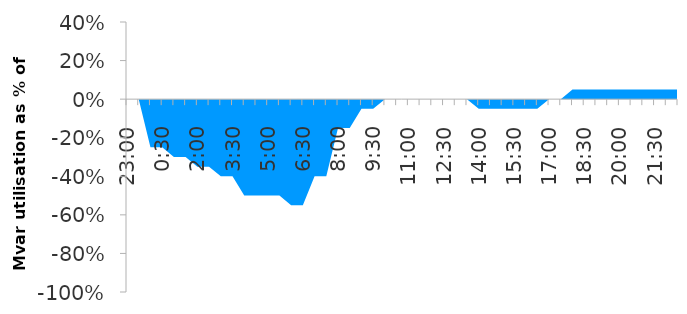
| Category | Series 0 |
|---|---|
| 0.9583333333333334 | 0 |
| 0.9791666666666666 | 0 |
| 0.0 | -0.25 |
| 0.020833333333333332 | -0.25 |
| 0.041666666666666664 | -0.3 |
| 0.0625 | -0.3 |
| 0.08333333333333333 | -0.35 |
| 0.10416666666666667 | -0.35 |
| 0.125 | -0.4 |
| 0.14583333333333334 | -0.4 |
| 0.16666666666666666 | -0.5 |
| 0.1875 | -0.5 |
| 0.20833333333333334 | -0.5 |
| 0.22916666666666666 | -0.5 |
| 0.25 | -0.55 |
| 0.2708333333333333 | -0.55 |
| 0.2916666666666667 | -0.4 |
| 0.3125 | -0.4 |
| 0.3333333333333333 | -0.15 |
| 0.3541666666666667 | -0.15 |
| 0.375 | -0.05 |
| 0.3958333333333333 | -0.05 |
| 0.4166666666666667 | 0 |
| 0.4375 | 0 |
| 0.4583333333333333 | 0 |
| 0.4791666666666667 | 0 |
| 0.5 | 0 |
| 0.5208333333333334 | 0 |
| 0.5416666666666666 | 0 |
| 0.5625 | 0 |
| 0.5833333333333334 | -0.05 |
| 0.6041666666666666 | -0.05 |
| 0.625 | -0.05 |
| 0.6458333333333334 | -0.05 |
| 0.6666666666666666 | -0.05 |
| 0.6875 | -0.05 |
| 0.7083333333333334 | 0 |
| 0.7291666666666666 | 0 |
| 0.75 | 0.05 |
| 0.7708333333333334 | 0.05 |
| 0.7916666666666666 | 0.05 |
| 0.8125 | 0.05 |
| 0.8333333333333334 | 0.05 |
| 0.8541666666666666 | 0.05 |
| 0.875 | 0.05 |
| 0.8958333333333334 | 0.05 |
| 0.9166666666666666 | 0.05 |
| 0.9375 | 0.05 |